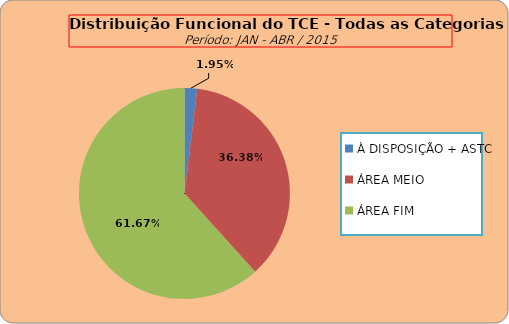
| Category | ÁREAS DE ATUAÇÃO |
|---|---|
| À DISPOSIÇÃO + ASTC | 10 |
| ÁREA MEIO | 187 |
| ÁREA FIM | 317 |